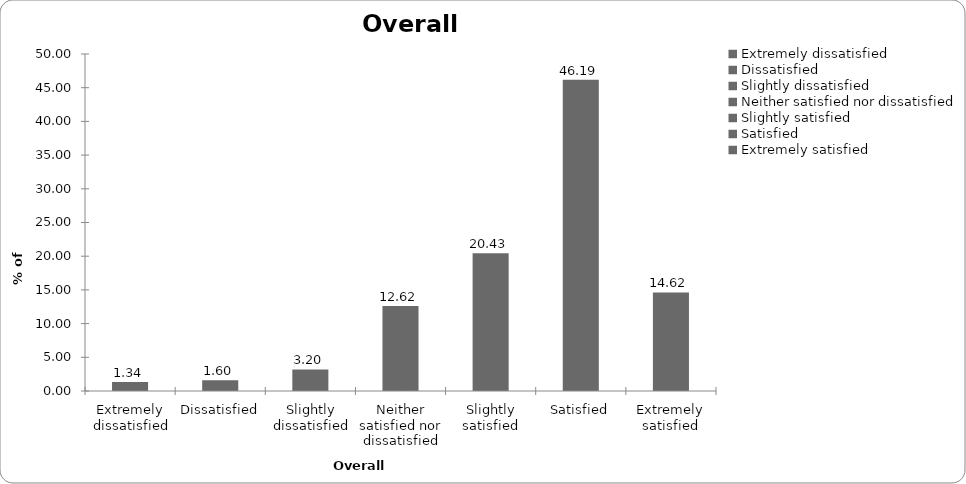
| Category | Overall satisfaction |
|---|---|
| Extremely dissatisfied | 1.335 |
| Dissatisfied | 1.602 |
| Slightly dissatisfied | 3.204 |
| Neither satisfied nor dissatisfied | 12.617 |
| Slightly satisfied | 20.427 |
| Satisfied | 46.195 |
| Extremely satisfied | 14.619 |